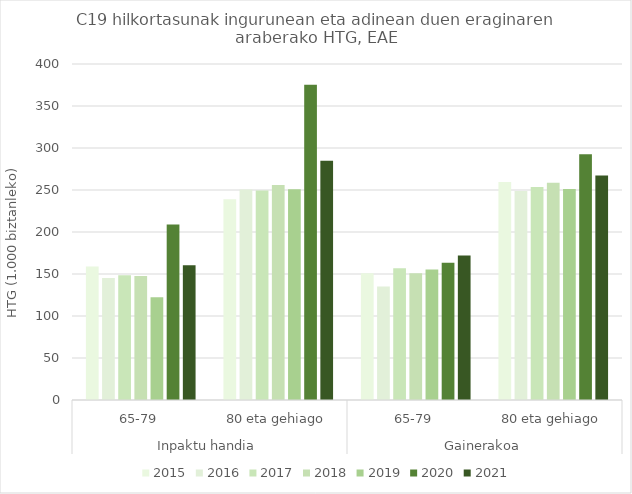
| Category | 2015 | 2016 | 2017 | 2018 | 2019 | 2020 | 2021 |
|---|---|---|---|---|---|---|---|
| 0 | 158.813 | 145.175 | 148.581 | 147.727 | 122.418 | 208.795 | 160.417 |
| 1 | 239.042 | 250.45 | 249.374 | 255.896 | 250.763 | 375.179 | 284.819 |
| 2 | 150.883 | 135.124 | 156.745 | 151.04 | 155.318 | 163.312 | 171.877 |
| 3 | 259.497 | 248.802 | 253.452 | 258.616 | 251.319 | 292.614 | 267.35 |